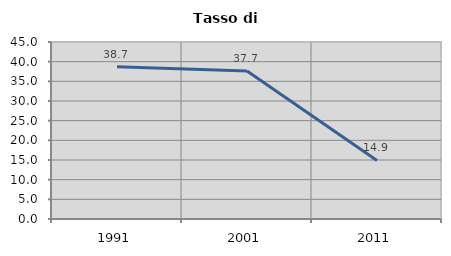
| Category | Tasso di disoccupazione   |
|---|---|
| 1991.0 | 38.682 |
| 2001.0 | 37.651 |
| 2011.0 | 14.884 |